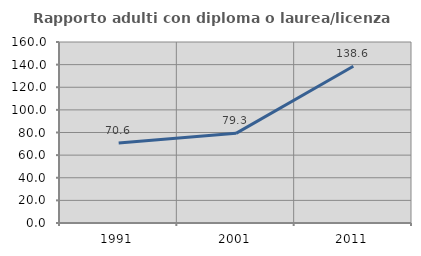
| Category | Rapporto adulti con diploma o laurea/licenza media  |
|---|---|
| 1991.0 | 70.629 |
| 2001.0 | 79.263 |
| 2011.0 | 138.554 |